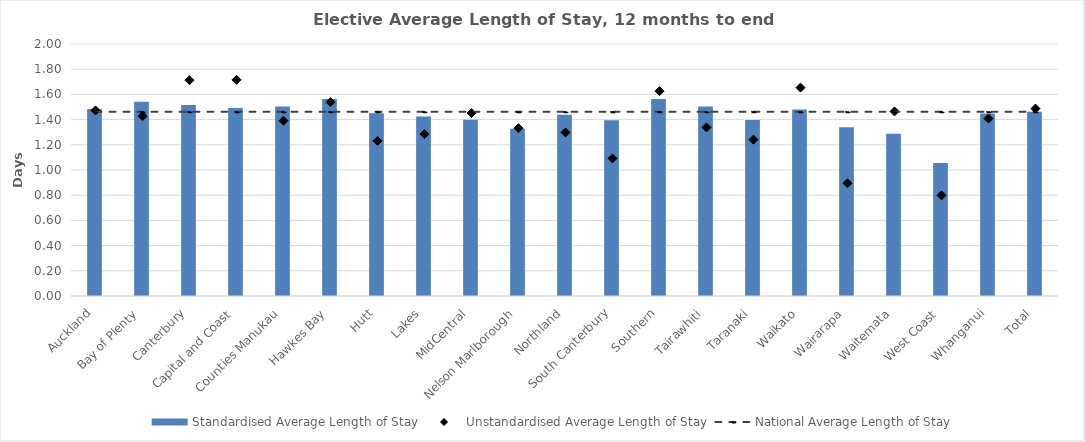
| Category | Standardised Average Length of Stay |
|---|---|
| Auckland | 1.485 |
| Bay of Plenty | 1.542 |
| Canterbury | 1.515 |
| Capital and Coast | 1.492 |
| Counties Manukau | 1.505 |
| Hawkes Bay | 1.564 |
| Hutt | 1.451 |
| Lakes | 1.424 |
| MidCentral | 1.399 |
| Nelson Marlborough | 1.327 |
| Northland | 1.439 |
| South Canterbury | 1.394 |
| Southern | 1.563 |
| Tairawhiti | 1.505 |
| Taranaki | 1.397 |
| Waikato | 1.48 |
| Wairarapa | 1.339 |
| Waitemata | 1.288 |
| West Coast | 1.055 |
| Whanganui | 1.449 |
| Total | 1.462 |